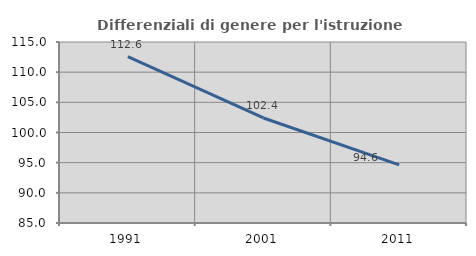
| Category | Differenziali di genere per l'istruzione superiore |
|---|---|
| 1991.0 | 112.568 |
| 2001.0 | 102.41 |
| 2011.0 | 94.638 |